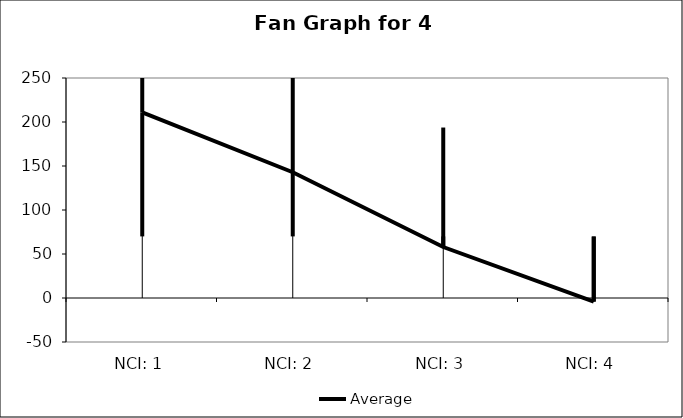
| Category | Average |
|---|---|
| NCI: 1 | 210.926 |
| NCI: 2 | 142.926 |
| NCI: 3 | 57.926 |
| NCI: 4 | -4.074 |